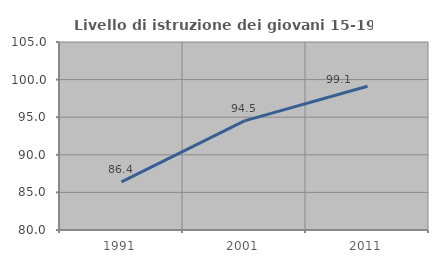
| Category | Livello di istruzione dei giovani 15-19 anni |
|---|---|
| 1991.0 | 86.405 |
| 2001.0 | 94.505 |
| 2011.0 | 99.111 |